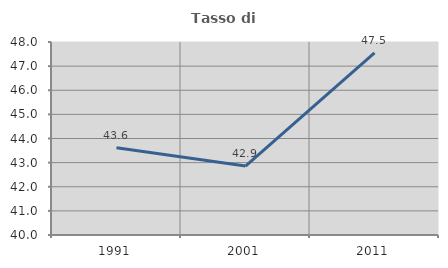
| Category | Tasso di occupazione   |
|---|---|
| 1991.0 | 43.619 |
| 2001.0 | 42.857 |
| 2011.0 | 47.545 |